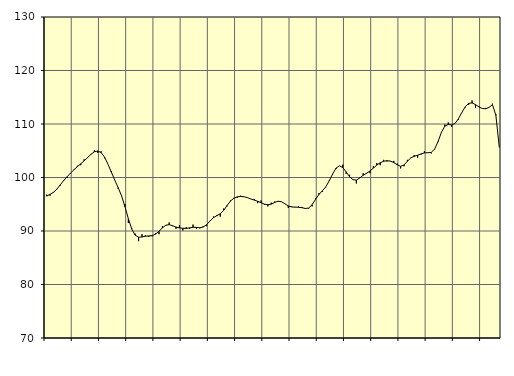
| Category | Piggar | Samtliga fast anställda (inkl. fast anställda utomlands) |
|---|---|---|
| nan | 96.8 | 96.53 |
| 87.0 | 96.6 | 96.85 |
| 87.0 | 97.3 | 97.23 |
| 87.0 | 97.8 | 97.84 |
| nan | 98.5 | 98.64 |
| 88.0 | 99.5 | 99.43 |
| 88.0 | 99.9 | 100.15 |
| 88.0 | 100.7 | 100.82 |
| nan | 101.5 | 101.44 |
| 89.0 | 102.2 | 102.02 |
| 89.0 | 102.3 | 102.57 |
| 89.0 | 103.4 | 103.11 |
| nan | 103.8 | 103.72 |
| 90.0 | 104.4 | 104.33 |
| 90.0 | 105.1 | 104.8 |
| 90.0 | 104.6 | 104.96 |
| nan | 104.9 | 104.65 |
| 91.0 | 103.6 | 103.81 |
| 91.0 | 102.5 | 102.5 |
| 91.0 | 101.2 | 101 |
| nan | 99.5 | 99.51 |
| 92.0 | 97.9 | 98.11 |
| 92.0 | 96.6 | 96.56 |
| 92.0 | 95 | 94.54 |
| nan | 91.5 | 92.28 |
| 93.0 | 90.5 | 90.35 |
| 93.0 | 89.5 | 89.22 |
| 93.0 | 88.1 | 88.84 |
| nan | 89.4 | 88.89 |
| 94.0 | 89.2 | 89.02 |
| 94.0 | 88.9 | 89.08 |
| 94.0 | 89 | 89.14 |
| nan | 89.6 | 89.43 |
| 95.0 | 89.4 | 89.95 |
| 95.0 | 90.9 | 90.58 |
| 95.0 | 91 | 91.08 |
| nan | 91.6 | 91.19 |
| 96.0 | 90.9 | 90.98 |
| 96.0 | 90.4 | 90.73 |
| 96.0 | 91.1 | 90.58 |
| nan | 90.1 | 90.51 |
| 97.0 | 90.7 | 90.48 |
| 97.0 | 90.4 | 90.59 |
| 97.0 | 91.2 | 90.7 |
| nan | 90.4 | 90.67 |
| 98.0 | 90.5 | 90.6 |
| 98.0 | 90.9 | 90.74 |
| 98.0 | 90.9 | 91.19 |
| nan | 91.9 | 91.87 |
| 99.0 | 92.7 | 92.49 |
| 99.0 | 93 | 92.87 |
| 99.0 | 92.7 | 93.23 |
| nan | 94.2 | 93.86 |
| 0.0 | 94.6 | 94.76 |
| 0.0 | 95.7 | 95.6 |
| 0.0 | 96.2 | 96.12 |
| nan | 96.2 | 96.39 |
| 1.0 | 96.6 | 96.45 |
| 1.0 | 96.4 | 96.4 |
| 1.0 | 96.2 | 96.23 |
| nan | 96 | 95.99 |
| 2.0 | 96 | 95.77 |
| 2.0 | 95.2 | 95.55 |
| 2.0 | 95.7 | 95.28 |
| nan | 94.9 | 95.01 |
| 3.0 | 94.6 | 94.91 |
| 3.0 | 95.3 | 95.02 |
| 3.0 | 95.5 | 95.34 |
| nan | 95.5 | 95.57 |
| 4.0 | 95.5 | 95.47 |
| 4.0 | 95.1 | 95.09 |
| 4.0 | 94.3 | 94.68 |
| nan | 94.6 | 94.49 |
| 5.0 | 94.5 | 94.46 |
| 5.0 | 94.6 | 94.44 |
| 5.0 | 94.5 | 94.36 |
| nan | 94.3 | 94.21 |
| 6.0 | 94.2 | 94.29 |
| 6.0 | 94.6 | 94.92 |
| 6.0 | 96.1 | 95.92 |
| nan | 97.1 | 96.83 |
| 7.0 | 97.3 | 97.5 |
| 7.0 | 98.2 | 98.24 |
| 7.0 | 99.4 | 99.35 |
| nan | 100.5 | 100.63 |
| 8.0 | 101.6 | 101.74 |
| 8.0 | 102.2 | 102.19 |
| 8.0 | 102.4 | 101.86 |
| nan | 100.7 | 101.05 |
| 9.0 | 100.5 | 100.15 |
| 9.0 | 99.6 | 99.59 |
| 9.0 | 98.9 | 99.52 |
| nan | 100 | 99.91 |
| 10.0 | 100.8 | 100.42 |
| 10.0 | 100.7 | 100.79 |
| 10.0 | 100.8 | 101.22 |
| nan | 102.1 | 101.76 |
| 11.0 | 102.7 | 102.32 |
| 11.0 | 102.3 | 102.76 |
| 11.0 | 103.3 | 103.03 |
| nan | 103 | 103.14 |
| 12.0 | 103 | 103.06 |
| 12.0 | 103.1 | 102.79 |
| 12.0 | 102.6 | 102.37 |
| nan | 101.7 | 102.09 |
| 13.0 | 102.1 | 102.34 |
| 13.0 | 103.3 | 103.04 |
| 13.0 | 103.7 | 103.67 |
| nan | 104.2 | 103.96 |
| 14.0 | 103.7 | 104.16 |
| 14.0 | 104.3 | 104.41 |
| 14.0 | 104.9 | 104.61 |
| nan | 104.6 | 104.63 |
| 15.0 | 104.5 | 104.68 |
| 15.0 | 105.3 | 105.33 |
| 15.0 | 106.6 | 106.71 |
| nan | 108.5 | 108.45 |
| 16.0 | 109.9 | 109.61 |
| 16.0 | 110.3 | 109.91 |
| 16.0 | 109.5 | 109.83 |
| nan | 110.1 | 110.1 |
| 17.0 | 110.8 | 111 |
| 17.0 | 112.2 | 112.16 |
| 17.0 | 113.1 | 113.22 |
| nan | 113.6 | 113.85 |
| 18.0 | 114.4 | 113.94 |
| 18.0 | 113 | 113.63 |
| 18.0 | 113.3 | 113.2 |
| nan | 112.9 | 112.9 |
| 19.0 | 113 | 112.85 |
| 19.0 | 113.1 | 113.12 |
| 19.0 | 113.8 | 113.61 |
| nan | 111.8 | 111.61 |
| 20.0 | 105.6 | 105.61 |